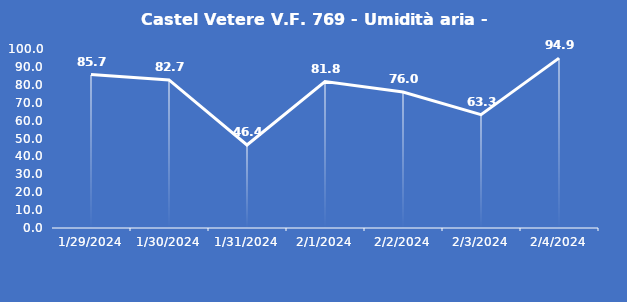
| Category | Castel Vetere V.F. 769 - Umidità aria - Grezzo (%) |
|---|---|
| 1/29/24 | 85.7 |
| 1/30/24 | 82.7 |
| 1/31/24 | 46.4 |
| 2/1/24 | 81.8 |
| 2/2/24 | 76 |
| 2/3/24 | 63.3 |
| 2/4/24 | 94.9 |